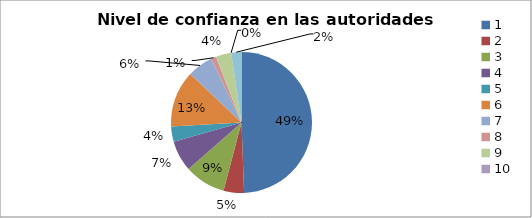
| Category | Series 0 |
|---|---|
| 0 | 0.494 |
| 1 | 0.047 |
| 2 | 0.094 |
| 3 | 0.071 |
| 4 | 0.035 |
| 5 | 0.129 |
| 6 | 0.059 |
| 7 | 0.012 |
| 8 | 0.035 |
| 9 | 0 |
| 10 | 0.024 |